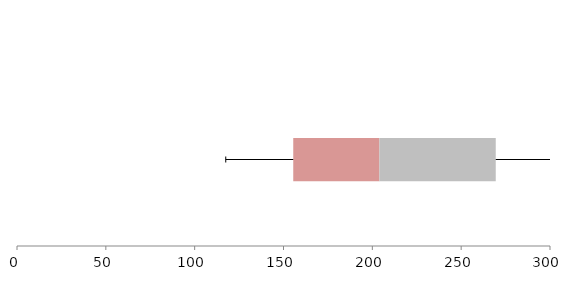
| Category | Series 1 | Series 2 | Series 3 |
|---|---|---|---|
| 0 | 155.49 | 48.482 | 65.496 |